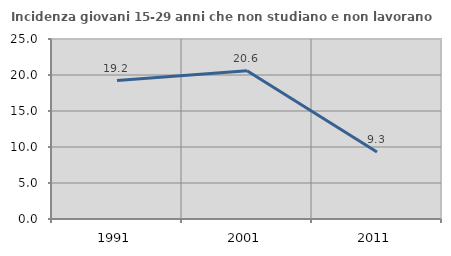
| Category | Incidenza giovani 15-29 anni che non studiano e non lavorano  |
|---|---|
| 1991.0 | 19.231 |
| 2001.0 | 20.588 |
| 2011.0 | 9.302 |